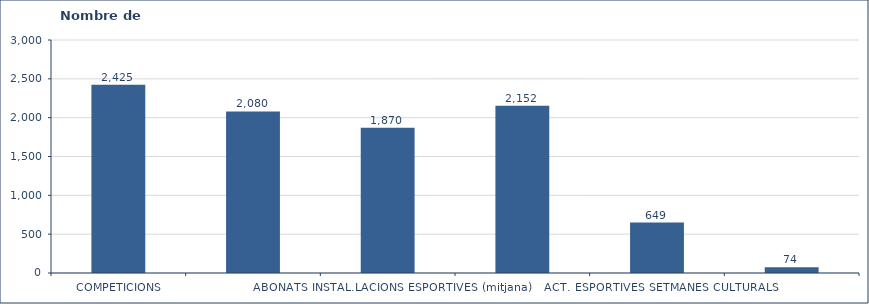
| Category | Nombre de participants |
|---|---|
| COMPETICIONS | 2425 |
| PROMOCIÓ ESPORTIVA I SALUT | 2080 |
| ABONATS INSTAL.LACIONS ESPORTIVES (mitjana) | 1870 |
| ACT. DIRIGIDES  (mitjana/mes) | 2152 |
| ACT. ESPORTIVES SETMANES CULTURALS | 649 |
| PROGRAMA ESPORTISTES ALT NIVELL UPC | 74 |